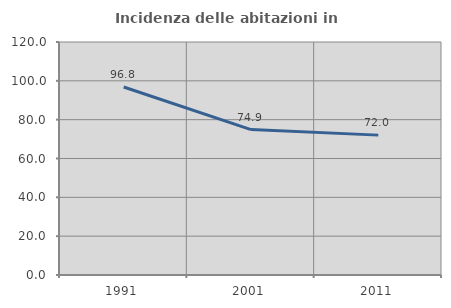
| Category | Incidenza delle abitazioni in proprietà  |
|---|---|
| 1991.0 | 96.818 |
| 2001.0 | 74.888 |
| 2011.0 | 72.038 |